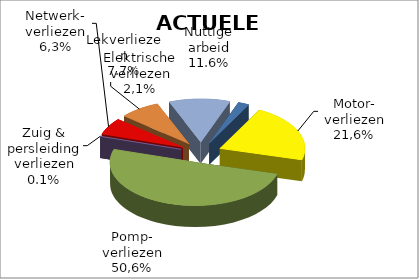
| Category | 3.4  ACTUELE ENERGIEBALANS |
|---|---|
| Elektrische verliezen | 1537.874 |
| Motorverliezen | 15920.412 |
| Pompverliezen | 37241.849 |
| Zuig & persleiding verliezen | 52.452 |
| Netwerkverliezen | 4652.843 |
| Lekverliezen | 5698.205 |
| Nuttige arbeid | 8547.308 |